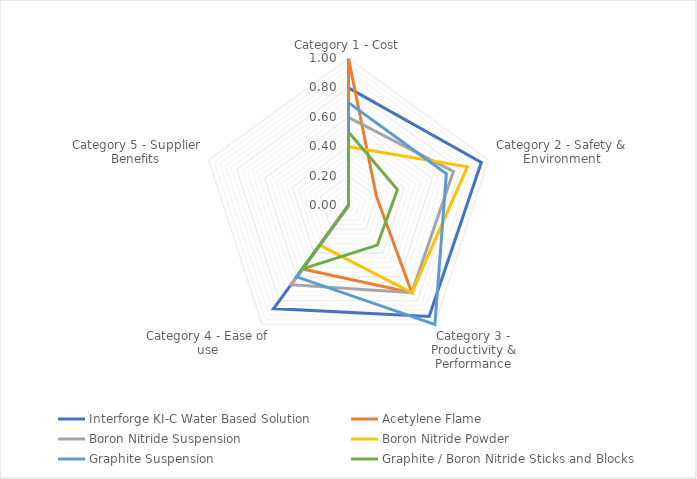
| Category | Interforge KI-C Water Based Solution | Acetylene Flame | Boron Nitride Suspension | Boron Nitride Powder | Graphite Suspension | Graphite / Boron Nitride Sticks and Blocks |
|---|---|---|---|---|---|---|
| Category 1 - Cost | 0.8 | 1 | 0.6 | 0.4 | 0.7 | 0.5 |
| Category 2 - Safety & Environment | 0.95 | 0.2 | 0.75 | 0.85 | 0.7 | 0.35 |
| Category 3 - Productivity & Performance | 0.933 | 0.733 | 0.733 | 0.733 | 1 | 0.333 |
| Category 4 - Ease of use | 0.867 | 0.533 | 0.667 | 0.333 | 0.6 | 0.533 |
| Category 5 - Supplier Benefits | 0 | 0 | 0 | 0 | 0 | 0 |